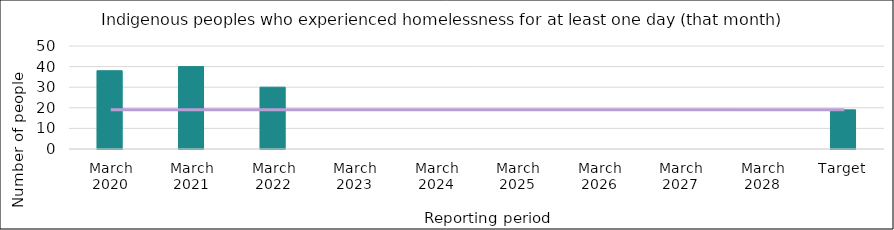
| Category | Series 0 |
|---|---|
| March 2020 | 38 |
| March 2021 | 40 |
| March 2022 | 30 |
| March 2023 | 0 |
| March 2024 | 0 |
| March 2025 | 0 |
| March 2026 | 0 |
| March 2027 | 0 |
| March 2028 | 0 |
| Target | 19 |